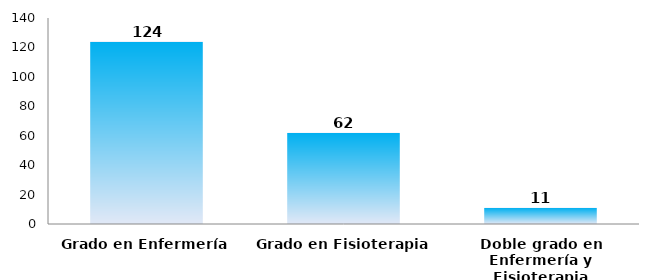
| Category | Series 0 |
|---|---|
| Grado en Enfermería | 124 |
| Grado en Fisioterapia | 62 |
| Doble grado en Enfermería y Fisioterapia | 11 |